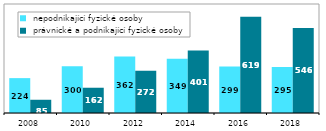
| Category |  nepodnikající fyzické osoby |  právnické a podnikající fyzické osoby |
|---|---|---|
| 2008.0 | 224 | 85 |
| 2010.0 | 300.261 | 162.228 |
| 2012.0 | 362.157 | 271.95 |
| 2014.0 | 348.572 | 400.742 |
| 2016.0 | 298.66 | 618.568 |
| 2018.0 | 294.977 | 546.307 |